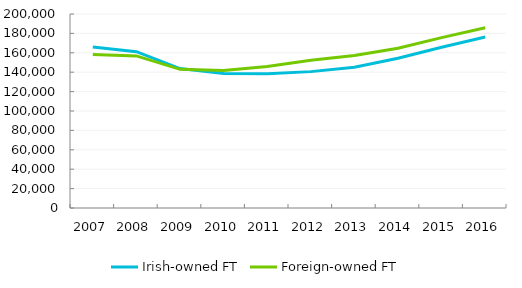
| Category | Irish-owned FT | Foreign-owned FT  |
|---|---|---|
| 2007.0 | 165906 | 158199 |
| 2008.0 | 161183 | 156798 |
| 2009.0 | 143699 | 142931 |
| 2010.0 | 138761 | 141759 |
| 2011.0 | 138464 | 145990 |
| 2012.0 | 140590 | 152279 |
| 2013.0 | 145169 | 157232 |
| 2014.0 | 154418 | 164666 |
| 2015.0 | 165760 | 175652 |
| 2016.0 | 176271 | 185773 |